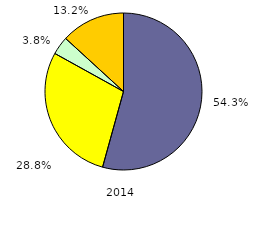
| Category | 54,3 28,8 3,8 13,2 |
|---|---|
| 0 | 54.294 |
| 1 | 28.755 |
| 2 | 3.753 |
| 3 | 13.198 |